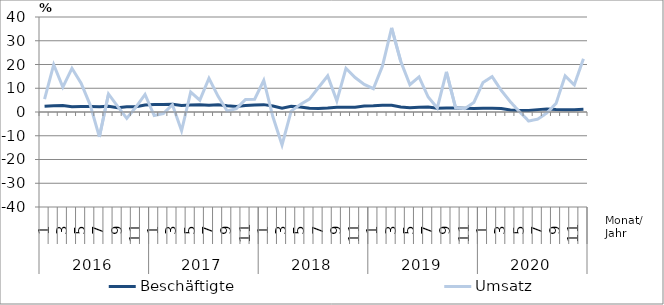
| Category | Beschäftigte | Umsatz |
|---|---|---|
| 0 | 2.4 | 5.4 |
| 1 | 2.6 | 19.9 |
| 2 | 2.7 | 10.5 |
| 3 | 2.2 | 18.4 |
| 4 | 2.3 | 12.1 |
| 5 | 2.3 | 2.9 |
| 6 | 2.2 | -10.5 |
| 7 | 2.4 | 7.6 |
| 8 | 1.8 | 2.4 |
| 9 | 2.2 | -2.7 |
| 10 | 2.2 | 2.1 |
| 11 | 2.9 | 7.4 |
| 12 | 3.2 | -1.5 |
| 13 | 3.2 | -0.7 |
| 14 | 3.3 | 3.1 |
| 15 | 2.7 | -7.9 |
| 16 | 2.9 | 8.4 |
| 17 | 3 | 5 |
| 18 | 2.8 | 14.2 |
| 19 | 3 | 6.6 |
| 20 | 2.6 | 0.4 |
| 21 | 2.3 | 1.4 |
| 22 | 2.7 | 5.3 |
| 23 | 2.9 | 5.4 |
| 24 | 3.1 | 13.3 |
| 25 | 2.5 | -2 |
| 26 | 1.6 | -13.9 |
| 27 | 2.4 | 0.4 |
| 28 | 2.1 | 3.2 |
| 29 | 1.6 | 5.4 |
| 30 | 1.5 | 10.3 |
| 31 | 1.7 | 15.2 |
| 32 | 2 | 4.7 |
| 33 | 2 | 18.4 |
| 34 | 2 | 14.5 |
| 35 | 2.5 | 11.6 |
| 36 | 2.6 | 9.8 |
| 37 | 2.8 | 19.4 |
| 38 | 2.8 | 35.4 |
| 39 | 2.1 | 21.3 |
| 40 | 1.8 | 11.5 |
| 41 | 2 | 14.8 |
| 42 | 2.1 | 6.3 |
| 43 | 1.6 | 1.7 |
| 44 | 1.7 | 16.9 |
| 45 | 1.7 | 1.8 |
| 46 | 1.6 | 1.4 |
| 47 | 1.5 | 4 |
| 48 | 1.6 | 12.4 |
| 49 | 1.6 | 14.9 |
| 50 | 1.5 | 9.1 |
| 51 | 0.8 | 4.3 |
| 52 | 0.6 | 0.1 |
| 53 | 0.6 | -3.8 |
| 54 | 1 | -3 |
| 55 | 1.3 | -0.4 |
| 56 | 1.1 | 3.6 |
| 57 | 1 | 15.2 |
| 58 | 1 | 11.4 |
| 59 | 1.2 | 22.4 |